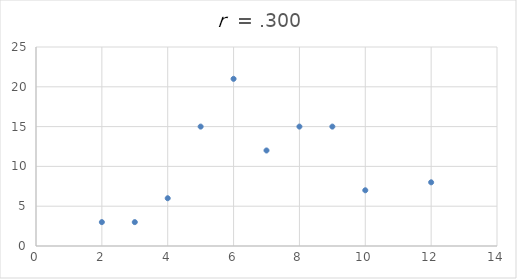
| Category | Series 0 |
|---|---|
| 2.0 | 3 |
| 4.0 | 6 |
| 7.0 | 12 |
| 5.0 | 15 |
| 8.0 | 15 |
| 6.0 | 21 |
| 9.0 | 15 |
| 12.0 | 8 |
| 3.0 | 3 |
| 10.0 | 7 |